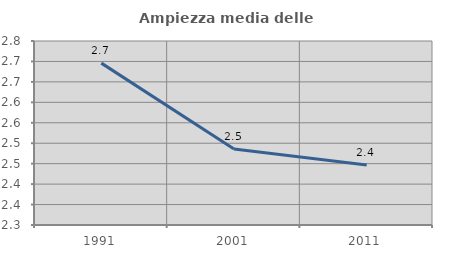
| Category | Ampiezza media delle famiglie |
|---|---|
| 1991.0 | 2.696 |
| 2001.0 | 2.486 |
| 2011.0 | 2.447 |